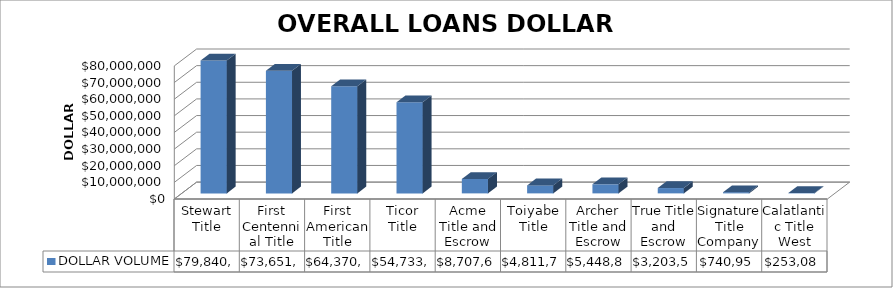
| Category | DOLLAR VOLUME |
|---|---|
| Stewart Title | 79840760.29 |
| First Centennial Title | 73651418 |
| First American Title | 64370083 |
| Ticor Title | 54733326 |
| Acme Title and Escrow | 8707647 |
| Toiyabe Title | 4811730 |
| Archer Title and Escrow | 5448892 |
| True Title and Escrow | 3203574 |
| Signature Title Company | 740950 |
| Calatlantic Title West | 253084 |